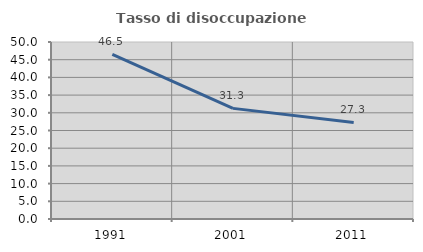
| Category | Tasso di disoccupazione giovanile  |
|---|---|
| 1991.0 | 46.512 |
| 2001.0 | 31.25 |
| 2011.0 | 27.273 |